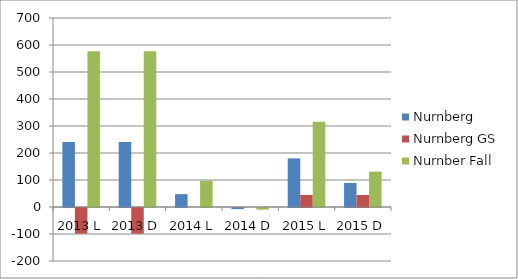
| Category | Nurnberg | Nurnberg GS | Nurnber Fall |
|---|---|---|---|
| 2013 L | 241.039 | -95.043 | 577.045 |
| 2013 D | 241.039 | -95.043 | 577.045 |
| 2014 L | 47.587 | 0 | 97.156 |
| 2014 D | -3.966 | 0 | -5.948 |
| 2015 L | 180.14 | 44.45 | 315.83 |
| 2015 D | 88.9 | 44.45 | 131.011 |